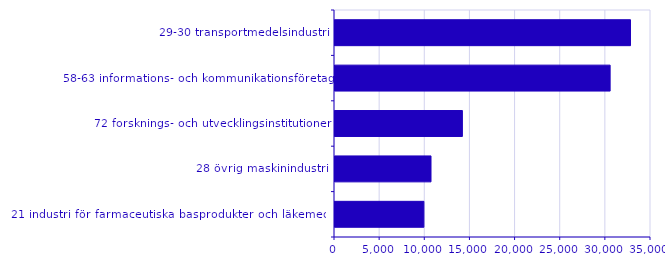
| Category | Series 0 |
|---|---|
| 29-30 transportmedelsindustri | 32730 |
| 58-63 informations- och kommunikationsföretag | 30474 |
| 72 forsknings- och utvecklingsinstitutioner | 14110 |
| 28 övrig maskinindustri | 10633 |
| 21 industri för farmaceutiska basprodukter och läkemedel | 9845 |